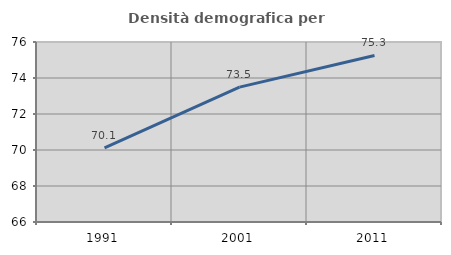
| Category | Densità demografica |
|---|---|
| 1991.0 | 70.117 |
| 2001.0 | 73.495 |
| 2011.0 | 75.251 |